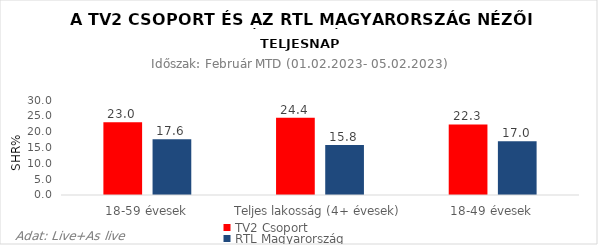
| Category | TV2 Csoport | RTL Magyarország |
|---|---|---|
| 18-59 évesek | 23 | 17.6 |
| Teljes lakosság (4+ évesek) | 24.4 | 15.8 |
| 18-49 évesek | 22.3 | 17 |